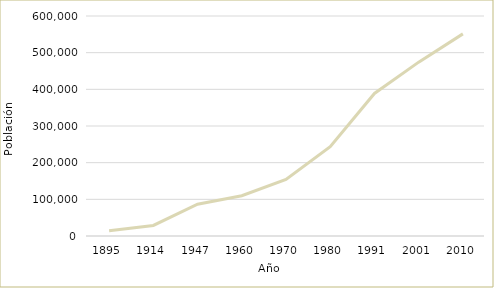
| Category | Series 0 |
|---|---|
| 1895.0 | 14517 |
| 1914.0 | 28866 |
| 1947.0 | 86836 |
| 1960.0 | 109890 |
| 1970.0 | 154143 |
| 1980.0 | 243850 |
| 1991.0 | 388833 |
| 2001.0 | 474155 |
| 2010.0 | 551266 |